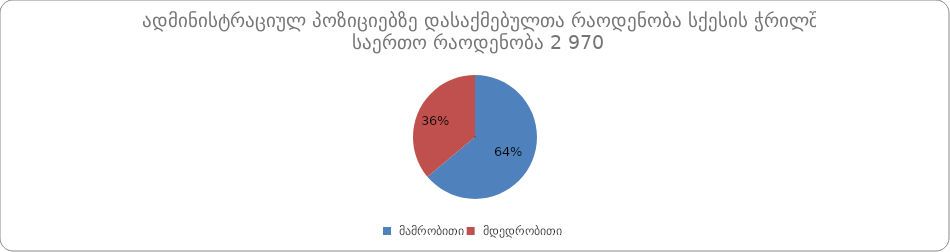
| Category | რაოდენობა |
|---|---|
|  მამრობითი | 1899 |
|  მდედრობითი | 1071 |